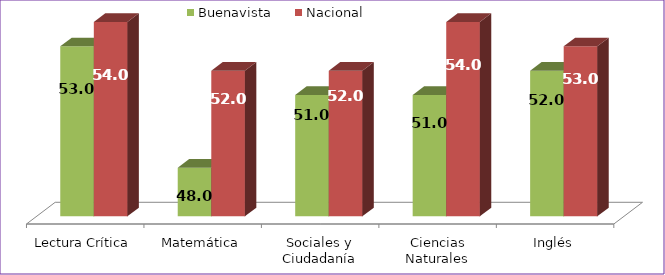
| Category | Buenavista | Nacional |
|---|---|---|
| Lectura Crítica | 53 | 54 |
| Matemática | 48 | 52 |
| Sociales y Ciudadanía | 51 | 52 |
| Ciencias Naturales | 51 | 54 |
| Inglés | 52 | 53 |